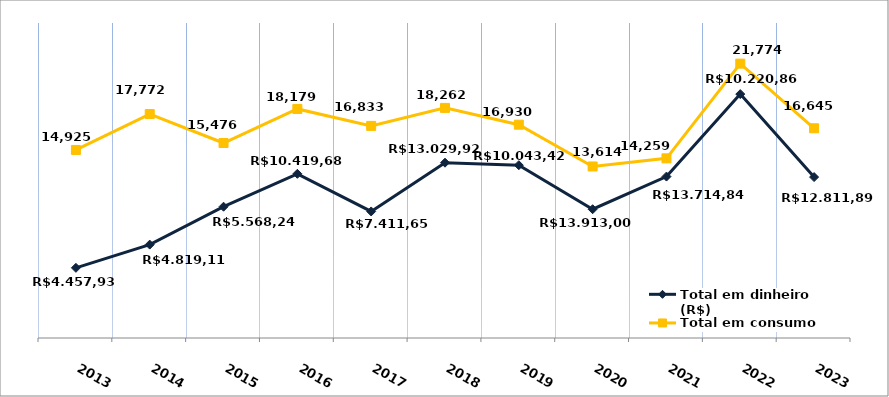
| Category | Total em dinheiro (R$) |
|---|---|
| 2013.0 | 5568.24 |
| 2014.0 | 7411.65 |
| 2015.0 | 10419.68 |
| 2016.0 | 13029.92 |
| 2017.0 | 10043.42 |
| 2018.0 | 13913 |
| 2019.0 | 13714.84 |
| 2020.0 | 10220.86 |
| 2021.0 | 12811.89 |
| 2022.0 | 19356.55 |
| 2023.0 | 12771.35 |